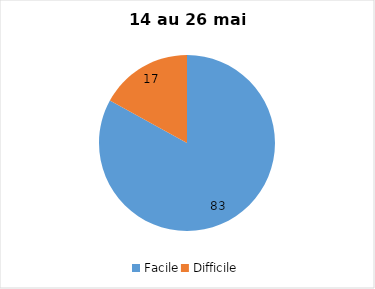
| Category | Series 0 |
|---|---|
| Facile | 83 |
| Difficile | 17 |